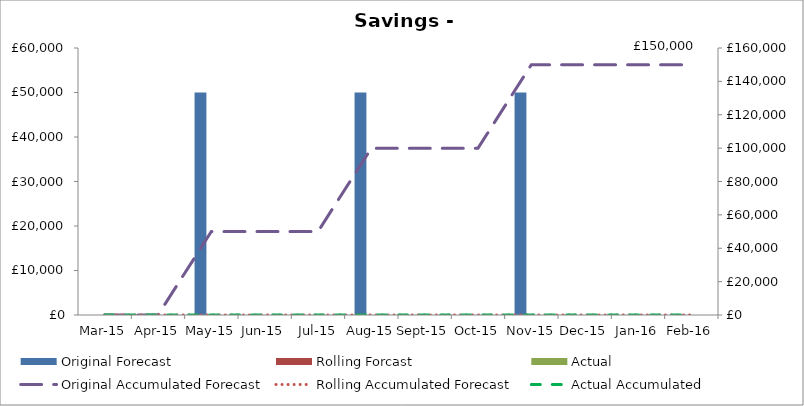
| Category | Original Forecast | Rolling Forcast | Actual |
|---|---|---|---|
| 2015-03-01 | 0 | 0 | 0 |
| 2015-04-01 | 0 | 0 | 0 |
| 2015-05-01 | 50000 | 0 | 0 |
| 2015-06-01 | 0 | 0 | 0 |
| 2015-07-01 | 0 | 0 | 0 |
| 2015-08-01 | 50000 | 0 | 0 |
| 2015-09-01 | 0 | 0 | 0 |
| 2015-10-01 | 0 | 0 | 0 |
| 2015-11-01 | 50000 | 0 | 0 |
| 2015-12-01 | 0 | 0 | 0 |
| 2016-01-01 | 0 | 0 | 0 |
| 2016-02-01 | 0 | 0 | 0 |